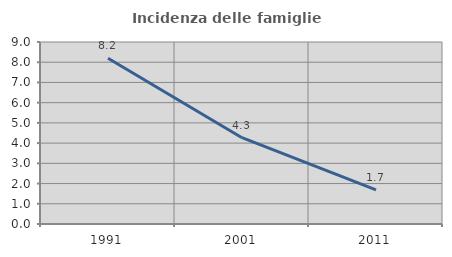
| Category | Incidenza delle famiglie numerose |
|---|---|
| 1991.0 | 8.199 |
| 2001.0 | 4.267 |
| 2011.0 | 1.689 |